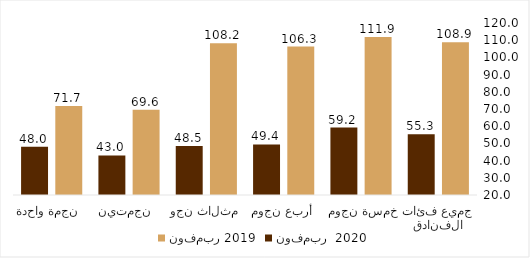
| Category | نوفمبر 2019 | نوفمبر  2020 |
|---|---|---|
| جميع فئات الفنادق | 108.86 | 55.269 |
|  خمسة نجوم  | 111.888 | 59.199 |
| أربع نجوم | 106.323 | 49.365 |
| ثلاث نجوم  | 108.246 | 48.541 |
| نجمتين  | 69.557 | 43.009 |
| نجمة واحدة  | 71.674 | 48.038 |